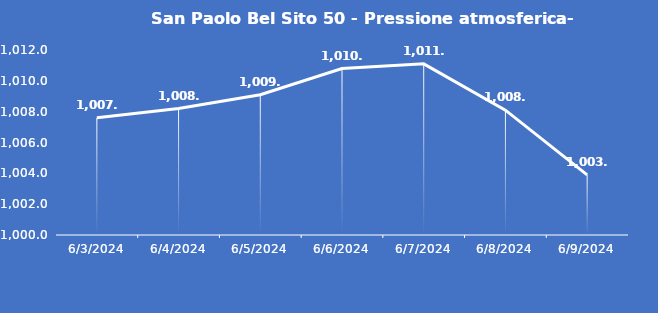
| Category | San Paolo Bel Sito 50 - Pressione atmosferica- Grezzo (hPa) |
|---|---|
| 6/3/24 | 1007.6 |
| 6/4/24 | 1008.2 |
| 6/5/24 | 1009.1 |
| 6/6/24 | 1010.8 |
| 6/7/24 | 1011.1 |
| 6/8/24 | 1008.1 |
| 6/9/24 | 1003.9 |